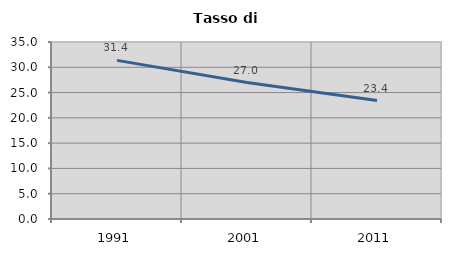
| Category | Tasso di disoccupazione   |
|---|---|
| 1991.0 | 31.364 |
| 2001.0 | 26.985 |
| 2011.0 | 23.414 |